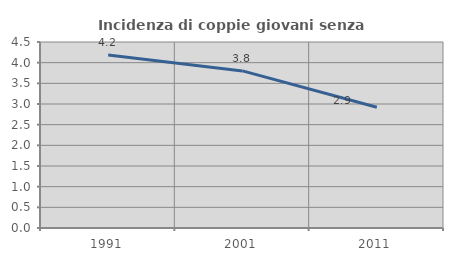
| Category | Incidenza di coppie giovani senza figli |
|---|---|
| 1991.0 | 4.185 |
| 2001.0 | 3.801 |
| 2011.0 | 2.922 |